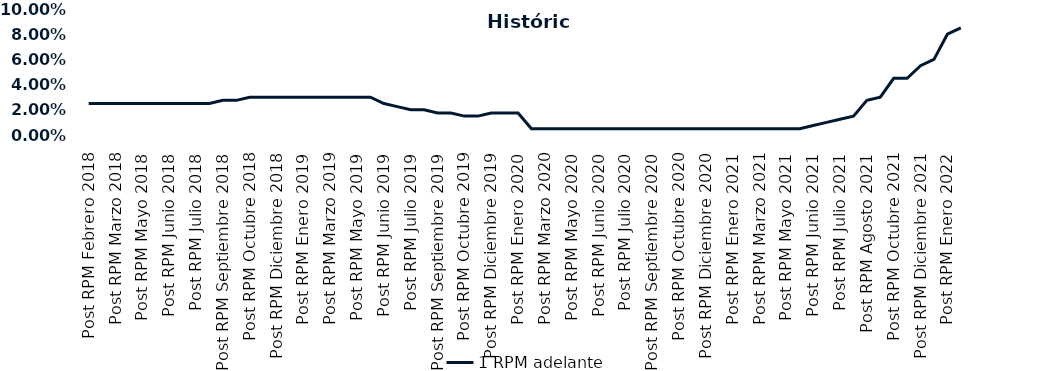
| Category | 1 RPM adelante |
|---|---|
| Post RPM Febrero 2018 | 0.025 |
| Pre RPM Marzo 2018 | 0.025 |
| Post RPM Marzo 2018 | 0.025 |
| Pre RPM Mayo 2018 | 0.025 |
| Post RPM Mayo 2018 | 0.025 |
| Pre RPM Junio 2018 | 0.025 |
| Post RPM Junio 2018 | 0.025 |
| Pre RPM Julio 2018 | 0.025 |
| Post RPM Julio 2018 | 0.025 |
| Pre RPM Septiembre 2018 | 0.025 |
| Post RPM Septiembre 2018 | 0.028 |
| Pre RPM Octubre 2018 | 0.028 |
| Post RPM Octubre 2018 | 0.03 |
| Pre RPM Diciembre 2018 | 0.03 |
| Post RPM Diciembre 2018 | 0.03 |
| Pre RPM Enero 2019 | 0.03 |
| Post RPM Enero 2019 | 0.03 |
| Pre RPM Marzo 2019 | 0.03 |
| Post RPM Marzo 2019 | 0.03 |
| Pre RPM Mayo 2019 | 0.03 |
| Post RPM Mayo 2019 | 0.03 |
| Pre RPM Junio 2019 | 0.03 |
| Post RPM Junio 2019 | 0.025 |
| Pre RPM Julio 2019 | 0.022 |
| Post RPM Julio 2019 | 0.02 |
| Pre RPM Septiembre 2019 | 0.02 |
| Post RPM Septiembre 2019 | 0.018 |
| Pre RPM Octubre 2019 | 0.018 |
| Post RPM Octubre 2019 | 0.015 |
| Pre RPM Diciembre 2019 | 0.015 |
| Post RPM Diciembre 2019 | 0.018 |
| Pre RPM Enero 2020 | 0.018 |
| Post RPM Enero 2020 | 0.018 |
| Pre RPM Marzo 2020 | 0.005 |
| Post RPM Marzo 2020 | 0.005 |
| Pre RPM Mayo 2020 | 0.005 |
| Post RPM Mayo 2020 | 0.005 |
| Pre RPM Junio 2020 | 0.005 |
| Post RPM Junio 2020 | 0.005 |
| Pre RPM Julio 2020 | 0.005 |
| Post RPM Julio 2020 | 0.005 |
| Pre RPM Septiembre 2020 | 0.005 |
| Post RPM Septiembre 2020 | 0.005 |
| Pre RPM Octubre 2020 | 0.005 |
| Post RPM Octubre 2020 | 0.005 |
| Pre RPM Diciembre 2020 | 0.005 |
| Post RPM Diciembre 2020 | 0.005 |
| Pre RPM Enero 2021 | 0.005 |
| Post RPM Enero 2021 | 0.005 |
| Pre RPM Marzo 2021 | 0.005 |
| Post RPM Marzo 2021 | 0.005 |
| Pre RPM Mayo 2021 | 0.005 |
| Post RPM Mayo 2021 | 0.005 |
| Pre RPM Junio 2021 | 0.005 |
| Post RPM Junio 2021 | 0.008 |
| Pre RPM Julio 2021 | 0.01 |
| Post RPM Julio 2021 | 0.012 |
| Pre RPM Agosto 2021 | 0.015 |
| Post RPM Agosto 2021 | 0.028 |
| Pre RPM Octubre 2021 | 0.03 |
| Post RPM Octubre 2021 | 0.045 |
| Pre RPM Diciembre 2021 | 0.045 |
| Post RPM Diciembre 2021 | 0.055 |
| Pre RPM Enero 2022 | 0.06 |
| Post RPM Enero 2022 | 0.08 |
| Pre RPM Marzo 2022 | 0.085 |